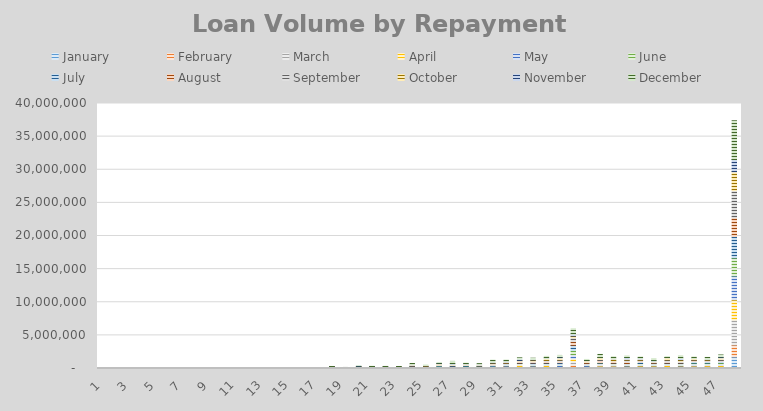
| Category | January | February | March | April | May | June | July | August | September | October | November | December |
|---|---|---|---|---|---|---|---|---|---|---|---|---|
| 1.0 | 344.37 | 0 | 440.92 | 190.96 | 732.75 | 0 | 59.59 | 18102.64 | 7967.22 | 8487.09 | 0 | 218.57 |
| 2.0 | 0 | 0 | 0 | 0 | 60 | 0 | 0 | 0 | 0 | 0 | 0 | 0 |
| 3.0 | 460.28 | 430.12 | 0 | 0 | 121.73 | 171.13 | 0 | 0 | 0 | 213.89 | 0 | 465.24 |
| 4.0 | 0 | 0 | 0 | 0 | 0 | 0 | 314.76 | 334.8 | 323.429 | 0 | 0 | 0 |
| 5.0 | 0 | 0 | 0 | 206.46 | 0 | 0 | 1356.58 | 0 | 0 | 0 | 0 | 0 |
| 6.0 | 0 | 0 | 0 | 0 | 0 | 0 | 0 | 0 | 0 | 0 | 0 | 0 |
| 7.0 | 0 | 0 | 0 | 0 | 272.24 | 0 | 0 | 5262.33 | 282.93 | 0 | 0 | 0 |
| 8.0 | 0 | 0 | 0 | 0 | 0 | 0 | 0 | 0 | 0 | 325.55 | 339.67 | 1271.67 |
| 9.0 | 0 | 0 | 0 | 362.41 | 1804.99 | 0 | 0 | 0 | 0 | 369.38 | 0 | 0 |
| 10.0 | 2074.95 | 573.39 | 0 | 1394.07 | 0 | 0 | 0 | 0 | 0 | 0 | 0 | 0 |
| 11.0 | 434.82 | 996.07 | 0 | 8212.37 | 424.64 | 0 | 427.77 | 0 | 0 | 0 | 3891.29 | 16822.54 |
| 12.0 | 0 | 876.36 | 0 | 0 | 645.52 | 0 | 468.644 | 1006.77 | 3336.204 | 973.16 | 0 | 4157.14 |
| 13.0 | 2438.78 | 0 | 7107.542 | 3794.53 | 2238.04 | 2169.4 | 3699.624 | 7023.8 | 0 | 0 | 0 | 21773.93 |
| 14.0 | 2791.21 | 0 | 0 | 21458.56 | 0 | 3755.936 | 1670.23 | 565.88 | 0 | 10093.21 | 570.61 | 10722.3 |
| 15.0 | 8457.24 | 5776.45 | 615.69 | 3414.05 | 3434.553 | 5863.3 | 15593.93 | 1377.96 | 587.51 | 2292.09 | 0 | 3406.95 |
| 16.0 | 1657.24 | 12046.77 | 2759.55 | 27077.79 | 8205.73 | 10332.8 | 6395.65 | 2961.621 | 2166.85 | 1206.8 | 2047.92 | 5801.09 |
| 17.0 | 16501.54 | 4939.51 | 10142.25 | 2869.88 | 7935.39 | 1338.54 | 26326.79 | 3857.65 | 15559.82 | 7641.684 | 39530.94 | 8463.611 |
| 18.0 | 10597.22 | 730.75 | 43789.358 | 139507.233 | 35826.06 | 19449.58 | 8856.679 | 714.05 | 23311.211 | 5134.333 | 5543.27 | 15308.87 |
| 19.0 | 4403.968 | 12760.56 | 5332.35 | 7474.962 | 48164.832 | 1523.992 | 13833.919 | 6443.04 | 14518.52 | 26365.652 | 5160.68 | 11485.67 |
| 20.0 | 20255.39 | 23305.83 | 8940.682 | 84187.669 | 11916.317 | 3490.09 | 19039.886 | 83286.11 | 28163.067 | 4002.779 | 102889.14 | 19570.97 |
| 21.0 | 6757.49 | 27686.439 | 2103.28 | 22584.154 | 44363.01 | 53055.594 | 40298.65 | 52832.02 | 24361.86 | 17530.04 | 9465.29 | 40790.774 |
| 22.0 | 20082.65 | 18565.008 | 32191.082 | 867.48 | 36199.93 | 20730.539 | 14498.368 | 43512.265 | 21352.06 | 34202.64 | 29054.68 | 56512.38 |
| 23.0 | 19266.13 | 41797.349 | 31190.377 | 6266.579 | 17272.59 | 10937.78 | 25272.158 | 25108.136 | 27084.23 | 16803.907 | 7262.979 | 78778.53 |
| 24.0 | 30147.82 | 106221.954 | 82059.508 | 18255.66 | 51232.693 | 28879.397 | 64619.928 | 37007.55 | 95231.993 | 35150.96 | 49089.661 | 152732.288 |
| 25.0 | 14010.568 | 11612.35 | 29389.843 | 15165.337 | 63851.141 | 49407.281 | 57654.259 | 52377.574 | 51439.73 | 70840.319 | 29767.29 | 80627.142 |
| 26.0 | 32091.585 | 83777.022 | 66223.253 | 67522.648 | 131837.447 | 30155.716 | 53826.231 | 31976.969 | 45843.675 | 145404.716 | 100548.523 | 97609.826 |
| 27.0 | 25212.63 | 15079.51 | 68899.186 | 75000.235 | 73505.32 | 28550.249 | 131368.815 | 37642.864 | 20284.094 | 96684.999 | 146899.83 | 349058.04 |
| 28.0 | 54470.95 | 37444.133 | 41389.926 | 102102.343 | 98180.785 | 10197.7 | 125937.363 | 54666.35 | 34530.91 | 67825.512 | 56140.007 | 130016.58 |
| 29.0 | 52131.65 | 25979.805 | 164420.344 | 28882.684 | 41748.21 | 33843.069 | 56854.46 | 54977.807 | 37212.76 | 40162.78 | 90381.15 | 100844.345 |
| 30.0 | 16634.855 | 87347.54 | 100884.775 | 98772.51 | 104939.768 | 76515.179 | 53987.011 | 104973.685 | 53439.458 | 137667.176 | 122658.52 | 307420.159 |
| 31.0 | 60314.667 | 98701.16 | 77559.08 | 96945.892 | 188860.356 | 66568.067 | 140187.031 | 74535.87 | 40547.281 | 92310.27 | 137843.07 | 208833.256 |
| 32.0 | 50454.744 | 37579.768 | 226808.411 | 230417.671 | 129855.231 | 89565.006 | 63492.602 | 199591.593 | 83714.19 | 101736.061 | 197743.491 | 195739.259 |
| 33.0 | 18683.71 | 126996.295 | 75418.926 | 116773.873 | 155472.559 | 75873.65 | 262330.405 | 148775.942 | 112767.981 | 189721.87 | 93035.382 | 173852.219 |
| 34.0 | 69473.97 | 87741.133 | 96329.443 | 194957.79 | 149598.308 | 95390.268 | 146748.243 | 197713.252 | 195114.39 | 256943.014 | 59783.85 | 278132.453 |
| 35.0 | 37203.434 | 27699.399 | 35107.67 | 198618.105 | 203233.375 | 82744.634 | 290810.163 | 168763.053 | 262904.577 | 269992.152 | 157190.846 | 234902.119 |
| 36.0 | 109856.726 | 423917.946 | 596743.995 | 356497.463 | 575391.536 | 673293.606 | 760436.574 | 565708.043 | 595402.164 | 244546.91 | 268782.63 | 826027.393 |
| 37.0 | 49655.865 | 88917.41 | 143678.942 | 34178.854 | 178165.003 | 48605.148 | 160751.616 | 166596.224 | 103677.78 | 182060.869 | 64279.96 | 148052.829 |
| 38.0 | 110407.141 | 122294.787 | 159759.569 | 115249.282 | 240915.475 | 48610.623 | 81061.269 | 295479.611 | 181176.965 | 256415.1 | 44262.327 | 474836.546 |
| 39.0 | 81687.76 | 127321.605 | 197426.065 | 72778.275 | 154712.25 | 128376.367 | 53896.971 | 233302.334 | 90653.587 | 281982.998 | 70324.621 | 279918.509 |
| 40.0 | 41185.758 | 99822.873 | 98663.364 | 111031.405 | 196649.923 | 85927.337 | 97209.825 | 215175.211 | 329016.713 | 124228.177 | 251715.984 | 250969.399 |
| 41.0 | 51005.948 | 88882.672 | 143025.166 | 120094.936 | 203723.523 | 145766.979 | 246802.766 | 137434.853 | 124982.546 | 147967.266 | 135844.017 | 198605.556 |
| 42.0 | 47752.98 | 80536.042 | 205529.76 | 72972.407 | 135351.346 | 135437.543 | 93691.676 | 70433.558 | 128940.803 | 55204.472 | 128191.684 | 336897.194 |
| 43.0 | 73448.79 | 71100.281 | 137382.068 | 192147.32 | 124124.279 | 80352.347 | 137222.748 | 144832.19 | 342492.084 | 309635.141 | 44103.322 | 134675.777 |
| 44.0 | 25834.369 | 150368.366 | 70177.978 | 121292.31 | 150198.027 | 192400.311 | 117741.09 | 91318.595 | 172773.48 | 230709.37 | 193268.434 | 410638.071 |
| 45.0 | 52452.799 | 150452.661 | 169152.772 | 57023.102 | 253621.759 | 130849.507 | 263005.379 | 144476.998 | 84396.9 | 185951.647 | 25135.816 | 227413.907 |
| 46.0 | 97127.136 | 155906.337 | 89069.465 | 135594.794 | 160868.315 | 177381.58 | 226808.853 | 74855.349 | 141721.234 | 91880.646 | 30686.359 | 304417.007 |
| 47.0 | 75014.452 | 65513.607 | 171996.688 | 145210.115 | 241311.119 | 184007.284 | 243514.565 | 103098.356 | 173293.568 | 186540.917 | 149060.733 | 301628.12 |
| 48.0 | 1779106.748 | 1762202.637 | 3786061.964 | 3039947.162 | 3605836.492 | 2727925.474 | 3221482.108 | 2847365.622 | 4084436.299 | 2823540.161 | 1852059.463 | 5864613.473 |